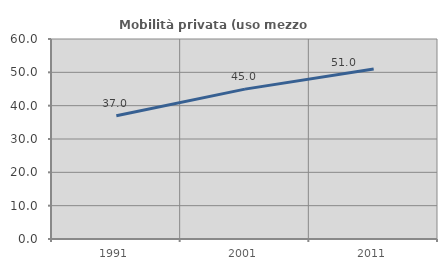
| Category | Mobilità privata (uso mezzo privato) |
|---|---|
| 1991.0 | 36.982 |
| 2001.0 | 44.959 |
| 2011.0 | 50.978 |